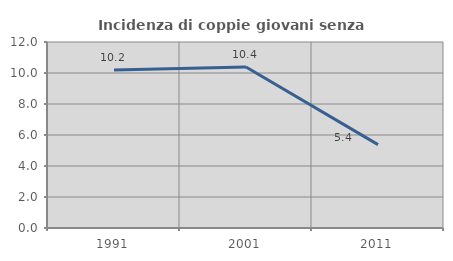
| Category | Incidenza di coppie giovani senza figli |
|---|---|
| 1991.0 | 10.199 |
| 2001.0 | 10.391 |
| 2011.0 | 5.38 |